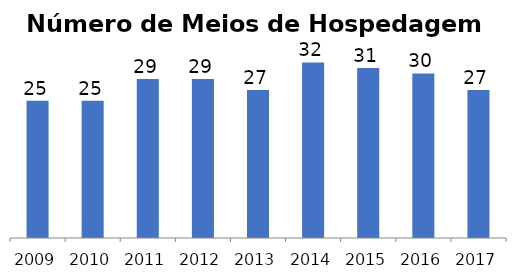
| Category | Meios de Hospedagem |
|---|---|
| 2009.0 | 25 |
| 2010.0 | 25 |
| 2011.0 | 29 |
| 2012.0 | 29 |
| 2013.0 | 27 |
| 2014.0 | 32 |
| 2015.0 | 31 |
| 2016.0 | 30 |
| 2017.0 | 27 |